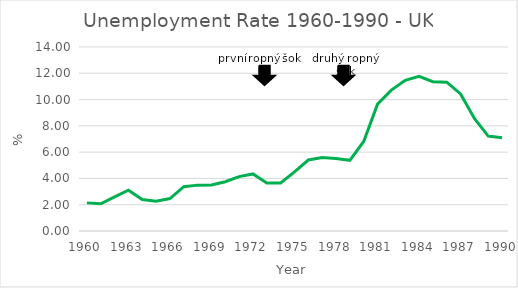
| Category | UK |
|---|---|
| 1960.0 | 2.14 |
| 1961.0 | 2.07 |
| 1962.0 | 2.6 |
| 1963.0 | 3.1 |
| 1964.0 | 2.4 |
| 1965.0 | 2.26 |
| 1966.0 | 2.47 |
| 1967.0 | 3.37 |
| 1968.0 | 3.49 |
| 1969.0 | 3.5 |
| 1970.0 | 3.75 |
| 1971.0 | 4.14 |
| 1972.0 | 4.34 |
| 1973.0 | 3.65 |
| 1974.0 | 3.65 |
| 1975.0 | 4.5 |
| 1976.0 | 5.4 |
| 1977.0 | 5.59 |
| 1978.0 | 5.51 |
| 1979.0 | 5.38 |
| 1980.0 | 6.81 |
| 1981.0 | 9.65 |
| 1982.0 | 10.72 |
| 1983.0 | 11.47 |
| 1984.0 | 11.77 |
| 1985.0 | 11.36 |
| 1986.0 | 11.32 |
| 1987.0 | 10.43 |
| 1988.0 | 8.57 |
| 1989.0 | 7.22 |
| 1990.0 | 7.1 |